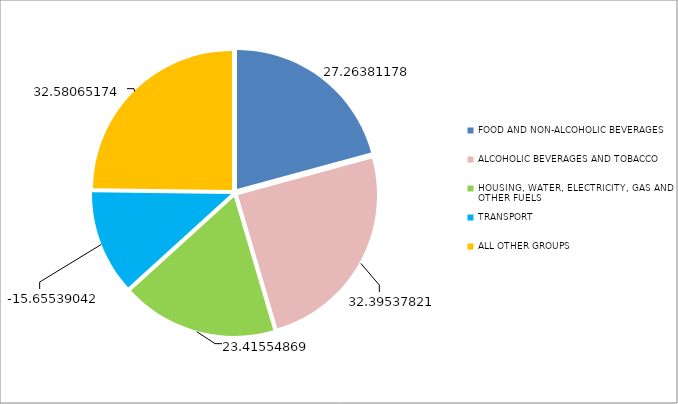
| Category | Series 0 |
|---|---|
| FOOD AND NON-ALCOHOLIC BEVERAGES  | 27.264 |
| ALCOHOLIC BEVERAGES AND TOBACCO | 32.395 |
| HOUSING, WATER, ELECTRICITY, GAS AND OTHER FUELS | 23.416 |
| TRANSPORT | -15.655 |
| ALL OTHER GROUPS | 32.581 |